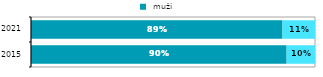
| Category |  muži |  ženy |
|---|---|---|
| 2015.0 | 0.9 | 0.1 |
| 2021.0 | 0.885 | 0.115 |